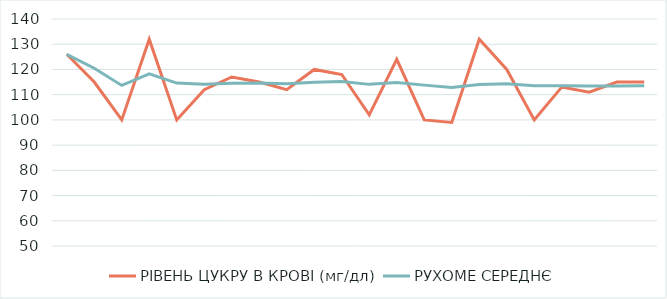
| Category | РІВЕНЬ ЦУКРУ В КРОВІ (мг/дл) | РУХОМЕ СЕРЕДНЄ |
|---|---|---|
| 0 | 126 | 126 |
| 1 | 115 | 120.5 |
| 2 | 100 | 113.667 |
| 3 | 132 | 118.25 |
| 4 | 100 | 114.6 |
| 5 | 112 | 114.167 |
| 6 | 117 | 114.571 |
| 7 | 115 | 114.625 |
| 8 | 112 | 114.333 |
| 9 | 120 | 114.9 |
| 10 | 118 | 115.182 |
| 11 | 102 | 114.083 |
| 12 | 124 | 114.846 |
| 13 | 100 | 113.786 |
| 14 | 99 | 112.8 |
| 15 | 132 | 114 |
| 16 | 120 | 114.353 |
| 17 | 100 | 113.556 |
| 18 | 113 | 113.526 |
| 19 | 111 | 113.4 |
| 20 | 115 | 113.476 |
| 21 | 115 | 113.545 |